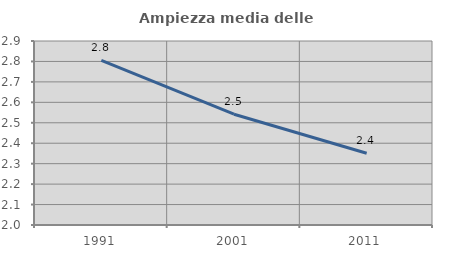
| Category | Ampiezza media delle famiglie |
|---|---|
| 1991.0 | 2.806 |
| 2001.0 | 2.542 |
| 2011.0 | 2.351 |